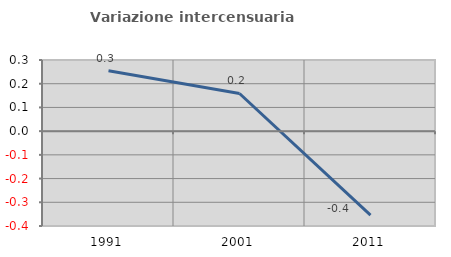
| Category | Variazione intercensuaria annua |
|---|---|
| 1991.0 | 0.255 |
| 2001.0 | 0.159 |
| 2011.0 | -0.354 |